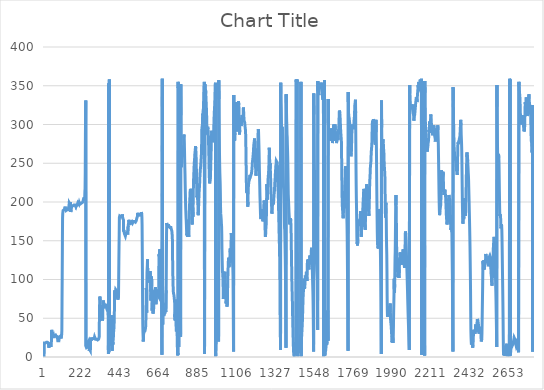
| Category | Series 0 |
|---|---|
| 0 | 0 |
| 1 | 18 |
| 2 | 18 |
| 3 | 18 |
| 4 | 18 |
| 5 | 18 |
| 6 | 18 |
| 7 | 18 |
| 8 | 18 |
| 9 | 19 |
| 10 | 19 |
| 11 | 19 |
| 12 | 19 |
| 13 | 19 |
| 14 | 19 |
| 15 | 19 |
| 16 | 19 |
| 17 | 19 |
| 18 | 19 |
| 19 | 19 |
| 20 | 19 |
| 21 | 19 |
| 22 | 19 |
| 23 | 19 |
| 24 | 18 |
| 25 | 18 |
| 26 | 14 |
| 27 | 12 |
| 28 | 13 |
| 29 | 15 |
| 30 | 15 |
| 31 | 15 |
| 32 | 15 |
| 33 | 15 |
| 34 | 15 |
| 35 | 15 |
| 36 | 15 |
| 37 | 15 |
| 38 | 15 |
| 39 | 15 |
| 40 | 15 |
| 41 | 15 |
| 42 | 16 |
| 43 | 35 |
| 44 | 30 |
| 45 | 28 |
| 46 | 27 |
| 47 | 26 |
| 48 | 26 |
| 49 | 26 |
| 50 | 26 |
| 51 | 26 |
| 52 | 28 |
| 53 | 26 |
| 54 | 26 |
| 55 | 25 |
| 56 | 26 |
| 57 | 26 |
| 58 | 26 |
| 59 | 26 |
| 60 | 26 |
| 61 | 27 |
| 62 | 30 |
| 63 | 29 |
| 64 | 28 |
| 65 | 28 |
| 66 | 28 |
| 67 | 27 |
| 68 | 27 |
| 69 | 27 |
| 70 | 27 |
| 71 | 27 |
| 72 | 27 |
| 73 | 27 |
| 74 | 27 |
| 75 | 26 |
| 76 | 26 |
| 77 | 23 |
| 78 | 21 |
| 79 | 21 |
| 80 | 21 |
| 81 | 21 |
| 82 | 21 |
| 83 | 21 |
| 84 | 21 |
| 85 | 21 |
| 86 | 21 |
| 87 | 26 |
| 88 | 26 |
| 89 | 26 |
| 90 | 26 |
| 91 | 26 |
| 92 | 26 |
| 93 | 27 |
| 94 | 27 |
| 95 | 27 |
| 96 | 24 |
| 97 | 23 |
| 98 | 23 |
| 99 | 23 |
| 100 | 29 |
| 101 | 34 |
| 102 | 72 |
| 103 | 104 |
| 104 | 141 |
| 105 | 179 |
| 106 | 185 |
| 107 | 187 |
| 108 | 189 |
| 109 | 190 |
| 110 | 190 |
| 111 | 189 |
| 112 | 189 |
| 113 | 190 |
| 114 | 190 |
| 115 | 190 |
| 116 | 190 |
| 117 | 190 |
| 118 | 192 |
| 119 | 193 |
| 120 | 194 |
| 121 | 192 |
| 122 | 191 |
| 123 | 191 |
| 124 | 191 |
| 125 | 189 |
| 126 | 189 |
| 127 | 189 |
| 128 | 189 |
| 129 | 189 |
| 130 | 189 |
| 131 | 190 |
| 132 | 190 |
| 133 | 190 |
| 134 | 190 |
| 135 | 190 |
| 136 | 190 |
| 137 | 190 |
| 138 | 190 |
| 139 | 190 |
| 140 | 190 |
| 141 | 190 |
| 142 | 196 |
| 143 | 199 |
| 144 | 198 |
| 145 | 198 |
| 146 | 198 |
| 147 | 198 |
| 148 | 197 |
| 149 | 197 |
| 150 | 200 |
| 151 | 195 |
| 152 | 187 |
| 153 | 190 |
| 154 | 190 |
| 155 | 190 |
| 156 | 190 |
| 157 | 194 |
| 158 | 195 |
| 159 | 194 |
| 160 | 194 |
| 161 | 194 |
| 162 | 194 |
| 163 | 195 |
| 164 | 194 |
| 165 | 194 |
| 166 | 196 |
| 167 | 196 |
| 168 | 196 |
| 169 | 196 |
| 170 | 195 |
| 171 | 195 |
| 172 | 195 |
| 173 | 195 |
| 174 | 195 |
| 175 | 196 |
| 176 | 196 |
| 177 | 195 |
| 178 | 195 |
| 179 | 195 |
| 180 | 194 |
| 181 | 195 |
| 182 | 195 |
| 183 | 197 |
| 184 | 195 |
| 185 | 196 |
| 186 | 196 |
| 187 | 196 |
| 188 | 196 |
| 189 | 197 |
| 190 | 197 |
| 191 | 197 |
| 192 | 199 |
| 193 | 199 |
| 194 | 198 |
| 195 | 198 |
| 196 | 198 |
| 197 | 198 |
| 198 | 197 |
| 199 | 198 |
| 200 | 199 |
| 201 | 198 |
| 202 | 198 |
| 203 | 197 |
| 204 | 198 |
| 205 | 198 |
| 206 | 198 |
| 207 | 198 |
| 208 | 198 |
| 209 | 198 |
| 210 | 198 |
| 211 | 199 |
| 212 | 199 |
| 213 | 199 |
| 214 | 199 |
| 215 | 199 |
| 216 | 199 |
| 217 | 200 |
| 218 | 200 |
| 219 | 200 |
| 220 | 200 |
| 221 | 200 |
| 222 | 202 |
| 223 | 202 |
| 224 | 202 |
| 225 | 203 |
| 226 | 203 |
| 227 | 203 |
| 228 | 206 |
| 229 | 204 |
| 230 | 202 |
| 231 | 206 |
| 232 | 214 |
| 233 | 217 |
| 234 | 239 |
| 235 | 287 |
| 236 | 310 |
| 237 | 331 |
| 238 | 14 |
| 239 | 15 |
| 240 | 14 |
| 241 | 12 |
| 242 | 12 |
| 243 | 13 |
| 244 | 13 |
| 245 | 11 |
| 246 | 11 |
| 247 | 13 |
| 248 | 15 |
| 249 | 18 |
| 250 | 18 |
| 251 | 19 |
| 252 | 19 |
| 253 | 20 |
| 254 | 20 |
| 255 | 17 |
| 256 | 15 |
| 257 | 8 |
| 258 | 10 |
| 259 | 9 |
| 260 | 10 |
| 261 | 10 |
| 262 | 10 |
| 263 | 8 |
| 264 | 9 |
| 265 | 25 |
| 266 | 21 |
| 267 | 23 |
| 268 | 23 |
| 269 | 22 |
| 270 | 23 |
| 271 | 23 |
| 272 | 23 |
| 273 | 23 |
| 274 | 23 |
| 275 | 23 |
| 276 | 23 |
| 277 | 23 |
| 278 | 24 |
| 279 | 24 |
| 280 | 24 |
| 281 | 24 |
| 282 | 24 |
| 283 | 24 |
| 284 | 24 |
| 285 | 24 |
| 286 | 24 |
| 287 | 26 |
| 288 | 25 |
| 289 | 25 |
| 290 | 25 |
| 291 | 25 |
| 292 | 23 |
| 293 | 23 |
| 294 | 23 |
| 295 | 23 |
| 296 | 23 |
| 297 | 23 |
| 298 | 23 |
| 299 | 22 |
| 300 | 22 |
| 301 | 22 |
| 302 | 22 |
| 303 | 22 |
| 304 | 22 |
| 305 | 22 |
| 306 | 22 |
| 307 | 22 |
| 308 | 22 |
| 309 | 22 |
| 310 | 23 |
| 311 | 23 |
| 312 | 24 |
| 313 | 26 |
| 314 | 40 |
| 315 | 58 |
| 316 | 72 |
| 317 | 78 |
| 318 | 77 |
| 319 | 73 |
| 320 | 67 |
| 321 | 64 |
| 322 | 61 |
| 323 | 59 |
| 324 | 57 |
| 325 | 56 |
| 326 | 56 |
| 327 | 56 |
| 328 | 53 |
| 329 | 51 |
| 330 | 49 |
| 331 | 48 |
| 332 | 47 |
| 333 | 49 |
| 334 | 65 |
| 335 | 68 |
| 336 | 73 |
| 337 | 72 |
| 338 | 70 |
| 339 | 70 |
| 340 | 69 |
| 341 | 70 |
| 342 | 70 |
| 343 | 69 |
| 344 | 68 |
| 345 | 65 |
| 346 | 65 |
| 347 | 65 |
| 348 | 66 |
| 349 | 66 |
| 350 | 66 |
| 351 | 66 |
| 352 | 65 |
| 353 | 65 |
| 354 | 64 |
| 355 | 65 |
| 356 | 66 |
| 357 | 66 |
| 358 | 66 |
| 359 | 66 |
| 360 | 66 |
| 361 | 67 |
| 362 | 67 |
| 363 | 63 |
| 364 | 55 |
| 365 | 13 |
| 366 | 4 |
| 367 | 353 |
| 368 | 6 |
| 369 | 6 |
| 370 | 6 |
| 371 | 358 |
| 372 | 15 |
| 373 | 25 |
| 374 | 28 |
| 375 | 29 |
| 376 | 32 |
| 377 | 35 |
| 378 | 39 |
| 379 | 41 |
| 380 | 42 |
| 381 | 40 |
| 382 | 54 |
| 383 | 49 |
| 384 | 37 |
| 385 | 34 |
| 386 | 14 |
| 387 | 8 |
| 388 | 18 |
| 389 | 20 |
| 390 | 18 |
| 391 | 16 |
| 392 | 19 |
| 393 | 24 |
| 394 | 26 |
| 395 | 32 |
| 396 | 34 |
| 397 | 37 |
| 398 | 42 |
| 399 | 51 |
| 400 | 65 |
| 401 | 84 |
| 402 | 86 |
| 403 | 82 |
| 404 | 76 |
| 405 | 83 |
| 406 | 84 |
| 407 | 87 |
| 408 | 88 |
| 409 | 86 |
| 410 | 88 |
| 411 | 88 |
| 412 | 88 |
| 413 | 85 |
| 414 | 84 |
| 415 | 85 |
| 416 | 83 |
| 417 | 80 |
| 418 | 77 |
| 419 | 74 |
| 420 | 75 |
| 421 | 73 |
| 422 | 75 |
| 423 | 78 |
| 424 | 101 |
| 425 | 123 |
| 426 | 142 |
| 427 | 158 |
| 428 | 180 |
| 429 | 181 |
| 430 | 182 |
| 431 | 182 |
| 432 | 181 |
| 433 | 181 |
| 434 | 181 |
| 435 | 181 |
| 436 | 181 |
| 437 | 181 |
| 438 | 181 |
| 439 | 181 |
| 440 | 181 |
| 441 | 181 |
| 442 | 182 |
| 443 | 181 |
| 444 | 182 |
| 445 | 184 |
| 446 | 182 |
| 447 | 179 |
| 448 | 180 |
| 449 | 180 |
| 450 | 180 |
| 451 | 177 |
| 452 | 162 |
| 453 | 164 |
| 454 | 162 |
| 455 | 162 |
| 456 | 161 |
| 457 | 159 |
| 458 | 159 |
| 459 | 159 |
| 460 | 159 |
| 461 | 158 |
| 462 | 156 |
| 463 | 157 |
| 464 | 158 |
| 465 | 159 |
| 466 | 159 |
| 467 | 159 |
| 468 | 160 |
| 469 | 160 |
| 470 | 161 |
| 471 | 161 |
| 472 | 161 |
| 473 | 161 |
| 474 | 160 |
| 475 | 158 |
| 476 | 159 |
| 477 | 159 |
| 478 | 169 |
| 479 | 171 |
| 480 | 172 |
| 481 | 173 |
| 482 | 177 |
| 483 | 174 |
| 484 | 172 |
| 485 | 171 |
| 486 | 172 |
| 487 | 172 |
| 488 | 171 |
| 489 | 172 |
| 490 | 172 |
| 491 | 173 |
| 492 | 172 |
| 493 | 174 |
| 494 | 175 |
| 495 | 175 |
| 496 | 175 |
| 497 | 175 |
| 498 | 175 |
| 499 | 175 |
| 500 | 175 |
| 501 | 174 |
| 502 | 174 |
| 503 | 173 |
| 504 | 174 |
| 505 | 174 |
| 506 | 174 |
| 507 | 175 |
| 508 | 175 |
| 509 | 175 |
| 510 | 175 |
| 511 | 175 |
| 512 | 175 |
| 513 | 175 |
| 514 | 175 |
| 515 | 175 |
| 516 | 174 |
| 517 | 174 |
| 518 | 174 |
| 519 | 174 |
| 520 | 175 |
| 521 | 175 |
| 522 | 175 |
| 523 | 175 |
| 524 | 176 |
| 525 | 177 |
| 526 | 177 |
| 527 | 179 |
| 528 | 180 |
| 529 | 178 |
| 530 | 180 |
| 531 | 182 |
| 532 | 186 |
| 533 | 183 |
| 534 | 183 |
| 535 | 183 |
| 536 | 183 |
| 537 | 183 |
| 538 | 183 |
| 539 | 184 |
| 540 | 184 |
| 541 | 183 |
| 542 | 184 |
| 543 | 185 |
| 544 | 184 |
| 545 | 183 |
| 546 | 184 |
| 547 | 184 |
| 548 | 183 |
| 549 | 184 |
| 550 | 184 |
| 551 | 184 |
| 552 | 184 |
| 553 | 187 |
| 554 | 188 |
| 555 | 185 |
| 556 | 181 |
| 557 | 171 |
| 558 | 143 |
| 559 | 110 |
| 560 | 69 |
| 561 | 42 |
| 562 | 32 |
| 563 | 31 |
| 564 | 20 |
| 565 | 26 |
| 566 | 30 |
| 567 | 31 |
| 568 | 32 |
| 569 | 32 |
| 570 | 32 |
| 571 | 32 |
| 572 | 32 |
| 573 | 33 |
| 574 | 34 |
| 575 | 33 |
| 576 | 34 |
| 577 | 35 |
| 578 | 40 |
| 579 | 52 |
| 580 | 66 |
| 581 | 89 |
| 582 | 85 |
| 583 | 57 |
| 584 | 87 |
| 585 | 109 |
| 586 | 110 |
| 587 | 119 |
| 588 | 126 |
| 589 | 106 |
| 590 | 99 |
| 591 | 99 |
| 592 | 104 |
| 593 | 99 |
| 594 | 96 |
| 595 | 97 |
| 596 | 95 |
| 597 | 98 |
| 598 | 103 |
| 599 | 102 |
| 600 | 99 |
| 601 | 99 |
| 602 | 111 |
| 603 | 112 |
| 604 | 103 |
| 605 | 94 |
| 606 | 78 |
| 607 | 73 |
| 608 | 80 |
| 609 | 86 |
| 610 | 94 |
| 611 | 104 |
| 612 | 91 |
| 613 | 77 |
| 614 | 60 |
| 615 | 63 |
| 616 | 75 |
| 617 | 73 |
| 618 | 58 |
| 619 | 56 |
| 620 | 57 |
| 621 | 58 |
| 622 | 59 |
| 623 | 63 |
| 624 | 68 |
| 625 | 78 |
| 626 | 82 |
| 627 | 86 |
| 628 | 85 |
| 629 | 86 |
| 630 | 83 |
| 631 | 87 |
| 632 | 87 |
| 633 | 90 |
| 634 | 85 |
| 635 | 79 |
| 636 | 68 |
| 637 | 68 |
| 638 | 69 |
| 639 | 81 |
| 640 | 87 |
| 641 | 86 |
| 642 | 85 |
| 643 | 85 |
| 644 | 83 |
| 645 | 82 |
| 646 | 80 |
| 647 | 80 |
| 648 | 80 |
| 649 | 81 |
| 650 | 80 |
| 651 | 78 |
| 652 | 104 |
| 653 | 131 |
| 654 | 133 |
| 655 | 130 |
| 656 | 130 |
| 657 | 139 |
| 658 | 140 |
| 659 | 139 |
| 660 | 140 |
| 661 | 138 |
| 662 | 136 |
| 663 | 139 |
| 664 | 139 |
| 665 | 129 |
| 666 | 106 |
| 667 | 87 |
| 668 | 58 |
| 669 | 25 |
| 670 | 3 |
| 671 | 4 |
| 672 | 359 |
| 673 | 359 |
| 674 | 42 |
| 675 | 54 |
| 676 | 70 |
| 677 | 67 |
| 678 | 64 |
| 679 | 60 |
| 680 | 53 |
| 681 | 54 |
| 682 | 55 |
| 683 | 55 |
| 684 | 54 |
| 685 | 55 |
| 686 | 56 |
| 687 | 56 |
| 688 | 57 |
| 689 | 59 |
| 690 | 61 |
| 691 | 62 |
| 692 | 58 |
| 693 | 59 |
| 694 | 86 |
| 695 | 120 |
| 696 | 157 |
| 697 | 173 |
| 698 | 171 |
| 699 | 172 |
| 700 | 172 |
| 701 | 170 |
| 702 | 169 |
| 703 | 167 |
| 704 | 169 |
| 705 | 168 |
| 706 | 167 |
| 707 | 171 |
| 708 | 171 |
| 709 | 169 |
| 710 | 169 |
| 711 | 168 |
| 712 | 168 |
| 713 | 168 |
| 714 | 168 |
| 715 | 167 |
| 716 | 167 |
| 717 | 167 |
| 718 | 167 |
| 719 | 167 |
| 720 | 167 |
| 721 | 167 |
| 722 | 166 |
| 723 | 165 |
| 724 | 164 |
| 725 | 164 |
| 726 | 163 |
| 727 | 163 |
| 728 | 162 |
| 729 | 155 |
| 730 | 142 |
| 731 | 116 |
| 732 | 105 |
| 733 | 97 |
| 734 | 85 |
| 735 | 85 |
| 736 | 82 |
| 737 | 82 |
| 738 | 80 |
| 739 | 78 |
| 740 | 79 |
| 741 | 77 |
| 742 | 71 |
| 743 | 52 |
| 744 | 55 |
| 745 | 47 |
| 746 | 51 |
| 747 | 74 |
| 748 | 72 |
| 749 | 59 |
| 750 | 45 |
| 751 | 35 |
| 752 | 33 |
| 753 | 32 |
| 754 | 38 |
| 755 | 41 |
| 756 | 43 |
| 757 | 27 |
| 758 | 5 |
| 759 | 2 |
| 760 | 5 |
| 761 | 3 |
| 762 | 355 |
| 763 | 347 |
| 764 | 351 |
| 765 | 13 |
| 766 | 32 |
| 767 | 51 |
| 768 | 71 |
| 769 | 80 |
| 770 | 92 |
| 771 | 99 |
| 772 | 100 |
| 773 | 95 |
| 774 | 83 |
| 775 | 57 |
| 776 | 26 |
| 777 | 352 |
| 778 | 312 |
| 779 | 273 |
| 780 | 248 |
| 781 | 245 |
| 782 | 252 |
| 783 | 256 |
| 784 | 256 |
| 785 | 256 |
| 786 | 261 |
| 787 | 262 |
| 788 | 261 |
| 789 | 263 |
| 790 | 262 |
| 791 | 259 |
| 792 | 262 |
| 793 | 271 |
| 794 | 282 |
| 795 | 287 |
| 796 | 283 |
| 797 | 277 |
| 798 | 269 |
| 799 | 256 |
| 800 | 245 |
| 801 | 236 |
| 802 | 223 |
| 803 | 212 |
| 804 | 201 |
| 805 | 192 |
| 806 | 186 |
| 807 | 180 |
| 808 | 176 |
| 809 | 170 |
| 810 | 163 |
| 811 | 157 |
| 812 | 158 |
| 813 | 159 |
| 814 | 157 |
| 815 | 155 |
| 816 | 160 |
| 817 | 169 |
| 818 | 177 |
| 819 | 177 |
| 820 | 168 |
| 821 | 161 |
| 822 | 155 |
| 823 | 163 |
| 824 | 173 |
| 825 | 182 |
| 826 | 190 |
| 827 | 196 |
| 828 | 202 |
| 829 | 207 |
| 830 | 213 |
| 831 | 215 |
| 832 | 217 |
| 833 | 216 |
| 834 | 213 |
| 835 | 211 |
| 836 | 206 |
| 837 | 200 |
| 838 | 196 |
| 839 | 194 |
| 840 | 185 |
| 841 | 173 |
| 842 | 171 |
| 843 | 182 |
| 844 | 189 |
| 845 | 184 |
| 846 | 181 |
| 847 | 193 |
| 848 | 213 |
| 849 | 221 |
| 850 | 230 |
| 851 | 236 |
| 852 | 241 |
| 853 | 247 |
| 854 | 251 |
| 855 | 255 |
| 856 | 257 |
| 857 | 262 |
| 858 | 264 |
| 859 | 265 |
| 860 | 269 |
| 861 | 272 |
| 862 | 269 |
| 863 | 265 |
| 864 | 260 |
| 865 | 251 |
| 866 | 239 |
| 867 | 225 |
| 868 | 210 |
| 869 | 206 |
| 870 | 208 |
| 871 | 208 |
| 872 | 206 |
| 873 | 206 |
| 874 | 198 |
| 875 | 188 |
| 876 | 183 |
| 877 | 184 |
| 878 | 191 |
| 879 | 199 |
| 880 | 206 |
| 881 | 212 |
| 882 | 216 |
| 883 | 217 |
| 884 | 223 |
| 885 | 230 |
| 886 | 234 |
| 887 | 238 |
| 888 | 242 |
| 889 | 243 |
| 890 | 246 |
| 891 | 246 |
| 892 | 247 |
| 893 | 245 |
| 894 | 246 |
| 895 | 264 |
| 896 | 284 |
| 897 | 295 |
| 898 | 296 |
| 899 | 295 |
| 900 | 300 |
| 901 | 308 |
| 902 | 314 |
| 903 | 312 |
| 904 | 307 |
| 905 | 318 |
| 906 | 323 |
| 907 | 331 |
| 908 | 340 |
| 909 | 346 |
| 910 | 351 |
| 911 | 355 |
| 912 | 4 |
| 913 | 4 |
| 914 | 352 |
| 915 | 341 |
| 916 | 341 |
| 917 | 343 |
| 918 | 345 |
| 919 | 340 |
| 920 | 335 |
| 921 | 330 |
| 922 | 324 |
| 923 | 319 |
| 924 | 311 |
| 925 | 302 |
| 926 | 293 |
| 927 | 287 |
| 928 | 289 |
| 929 | 295 |
| 930 | 297 |
| 931 | 296 |
| 932 | 294 |
| 933 | 291 |
| 934 | 285 |
| 935 | 276 |
| 936 | 267 |
| 937 | 257 |
| 938 | 244 |
| 939 | 235 |
| 940 | 228 |
| 941 | 224 |
| 942 | 224 |
| 943 | 223 |
| 944 | 224 |
| 945 | 225 |
| 946 | 234 |
| 947 | 244 |
| 948 | 253 |
| 949 | 262 |
| 950 | 269 |
| 951 | 279 |
| 952 | 286 |
| 953 | 292 |
| 954 | 291 |
| 955 | 284 |
| 956 | 281 |
| 957 | 286 |
| 958 | 291 |
| 959 | 289 |
| 960 | 277 |
| 961 | 280 |
| 962 | 285 |
| 963 | 286 |
| 964 | 293 |
| 965 | 299 |
| 966 | 306 |
| 967 | 313 |
| 968 | 318 |
| 969 | 321 |
| 970 | 327 |
| 971 | 332 |
| 972 | 340 |
| 973 | 347 |
| 974 | 354 |
| 975 | 1 |
| 976 | 5 |
| 977 | 11 |
| 978 | 17 |
| 979 | 22 |
| 980 | 27 |
| 981 | 31 |
| 982 | 37 |
| 983 | 42 |
| 984 | 47 |
| 985 | 51 |
| 986 | 54 |
| 987 | 58 |
| 988 | 60 |
| 989 | 56 |
| 990 | 54 |
| 991 | 40 |
| 992 | 20 |
| 993 | 357 |
| 994 | 333 |
| 995 | 305 |
| 996 | 282 |
| 997 | 263 |
| 998 | 249 |
| 999 | 238 |
| 1000 | 231 |
| 1001 | 224 |
| 1002 | 212 |
| 1003 | 194 |
| 1004 | 185 |
| 1005 | 183 |
| 1006 | 180 |
| 1007 | 177 |
| 1008 | 171 |
| 1009 | 169 |
| 1010 | 159 |
| 1011 | 139 |
| 1012 | 128 |
| 1013 | 118 |
| 1014 | 109 |
| 1015 | 109 |
| 1016 | 111 |
| 1017 | 103 |
| 1018 | 86 |
| 1019 | 75 |
| 1020 | 77 |
| 1021 | 81 |
| 1022 | 82 |
| 1023 | 85 |
| 1024 | 93 |
| 1025 | 99 |
| 1026 | 103 |
| 1027 | 107 |
| 1028 | 110 |
| 1029 | 106 |
| 1030 | 99 |
| 1031 | 91 |
| 1032 | 84 |
| 1033 | 77 |
| 1034 | 69 |
| 1035 | 68 |
| 1036 | 72 |
| 1037 | 77 |
| 1038 | 81 |
| 1039 | 69 |
| 1040 | 65 |
| 1041 | 65 |
| 1042 | 74 |
| 1043 | 85 |
| 1044 | 98 |
| 1045 | 107 |
| 1046 | 114 |
| 1047 | 121 |
| 1048 | 126 |
| 1049 | 128 |
| 1050 | 123 |
| 1051 | 116 |
| 1052 | 115 |
| 1053 | 120 |
| 1054 | 123 |
| 1055 | 124 |
| 1056 | 129 |
| 1057 | 134 |
| 1058 | 140 |
| 1059 | 135 |
| 1060 | 128 |
| 1061 | 129 |
| 1062 | 139 |
| 1063 | 149 |
| 1064 | 160 |
| 1065 | 160 |
| 1066 | 155 |
| 1067 | 144 |
| 1068 | 136 |
| 1069 | 137 |
| 1070 | 130 |
| 1071 | 123 |
| 1072 | 117 |
| 1073 | 115 |
| 1074 | 105 |
| 1075 | 74 |
| 1076 | 38 |
| 1077 | 7 |
| 1078 | 338 |
| 1079 | 310 |
| 1080 | 295 |
| 1081 | 290 |
| 1082 | 285 |
| 1083 | 279 |
| 1084 | 279 |
| 1085 | 289 |
| 1086 | 304 |
| 1087 | 316 |
| 1088 | 323 |
| 1089 | 329 |
| 1090 | 327 |
| 1091 | 325 |
| 1092 | 315 |
| 1093 | 305 |
| 1094 | 298 |
| 1095 | 291 |
| 1096 | 293 |
| 1097 | 299 |
| 1098 | 303 |
| 1099 | 308 |
| 1100 | 315 |
| 1101 | 323 |
| 1102 | 324 |
| 1103 | 317 |
| 1104 | 323 |
| 1105 | 330 |
| 1106 | 329 |
| 1107 | 325 |
| 1108 | 317 |
| 1109 | 305 |
| 1110 | 295 |
| 1111 | 287 |
| 1112 | 293 |
| 1113 | 299 |
| 1114 | 303 |
| 1115 | 308 |
| 1116 | 309 |
| 1117 | 306 |
| 1118 | 302 |
| 1119 | 301 |
| 1120 | 298 |
| 1121 | 298 |
| 1122 | 302 |
| 1123 | 304 |
| 1124 | 309 |
| 1125 | 312 |
| 1126 | 311 |
| 1127 | 309 |
| 1128 | 308 |
| 1129 | 304 |
| 1130 | 303 |
| 1131 | 310 |
| 1132 | 317 |
| 1133 | 322 |
| 1134 | 318 |
| 1135 | 313 |
| 1136 | 308 |
| 1137 | 305 |
| 1138 | 304 |
| 1139 | 304 |
| 1140 | 303 |
| 1141 | 301 |
| 1142 | 298 |
| 1143 | 297 |
| 1144 | 297 |
| 1145 | 292 |
| 1146 | 285 |
| 1147 | 272 |
| 1148 | 255 |
| 1149 | 238 |
| 1150 | 223 |
| 1151 | 215 |
| 1152 | 212 |
| 1153 | 216 |
| 1154 | 218 |
| 1155 | 214 |
| 1156 | 208 |
| 1157 | 200 |
| 1158 | 194 |
| 1159 | 200 |
| 1160 | 212 |
| 1161 | 219 |
| 1162 | 222 |
| 1163 | 224 |
| 1164 | 226 |
| 1165 | 228 |
| 1166 | 231 |
| 1167 | 230 |
| 1168 | 229 |
| 1169 | 233 |
| 1170 | 235 |
| 1171 | 236 |
| 1172 | 234 |
| 1173 | 233 |
| 1174 | 232 |
| 1175 | 233 |
| 1176 | 235 |
| 1177 | 235 |
| 1178 | 235 |
| 1179 | 237 |
| 1180 | 239 |
| 1181 | 240 |
| 1182 | 243 |
| 1183 | 247 |
| 1184 | 251 |
| 1185 | 253 |
| 1186 | 255 |
| 1187 | 257 |
| 1188 | 256 |
| 1189 | 258 |
| 1190 | 265 |
| 1191 | 270 |
| 1192 | 273 |
| 1193 | 276 |
| 1194 | 277 |
| 1195 | 278 |
| 1196 | 282 |
| 1197 | 277 |
| 1198 | 271 |
| 1199 | 263 |
| 1200 | 257 |
| 1201 | 250 |
| 1202 | 246 |
| 1203 | 240 |
| 1204 | 234 |
| 1205 | 233 |
| 1206 | 236 |
| 1207 | 241 |
| 1208 | 244 |
| 1209 | 247 |
| 1210 | 251 |
| 1211 | 258 |
| 1212 | 262 |
| 1213 | 265 |
| 1214 | 270 |
| 1215 | 277 |
| 1216 | 285 |
| 1217 | 291 |
| 1218 | 294 |
| 1219 | 291 |
| 1220 | 283 |
| 1221 | 274 |
| 1222 | 265 |
| 1223 | 253 |
| 1224 | 240 |
| 1225 | 230 |
| 1226 | 220 |
| 1227 | 208 |
| 1228 | 201 |
| 1229 | 193 |
| 1230 | 185 |
| 1231 | 180 |
| 1232 | 178 |
| 1233 | 177 |
| 1234 | 177 |
| 1235 | 177 |
| 1236 | 177 |
| 1237 | 179 |
| 1238 | 185 |
| 1239 | 191 |
| 1240 | 189 |
| 1241 | 185 |
| 1242 | 183 |
| 1243 | 177 |
| 1244 | 175 |
| 1245 | 176 |
| 1246 | 180 |
| 1247 | 185 |
| 1248 | 190 |
| 1249 | 196 |
| 1250 | 199 |
| 1251 | 202 |
| 1252 | 202 |
| 1253 | 198 |
| 1254 | 190 |
| 1255 | 178 |
| 1256 | 168 |
| 1257 | 158 |
| 1258 | 155 |
| 1259 | 157 |
| 1260 | 161 |
| 1261 | 167 |
| 1262 | 169 |
| 1263 | 176 |
| 1264 | 186 |
| 1265 | 205 |
| 1266 | 223 |
| 1267 | 224 |
| 1268 | 215 |
| 1269 | 203 |
| 1270 | 204 |
| 1271 | 212 |
| 1272 | 221 |
| 1273 | 229 |
| 1274 | 228 |
| 1275 | 235 |
| 1276 | 232 |
| 1277 | 240 |
| 1278 | 249 |
| 1279 | 258 |
| 1280 | 270 |
| 1281 | 266 |
| 1282 | 255 |
| 1283 | 251 |
| 1284 | 248 |
| 1285 | 250 |
| 1286 | 243 |
| 1287 | 235 |
| 1288 | 229 |
| 1289 | 220 |
| 1290 | 213 |
| 1291 | 207 |
| 1292 | 203 |
| 1293 | 197 |
| 1294 | 190 |
| 1295 | 185 |
| 1296 | 188 |
| 1297 | 192 |
| 1298 | 196 |
| 1299 | 198 |
| 1300 | 203 |
| 1301 | 203 |
| 1302 | 199 |
| 1303 | 197 |
| 1304 | 199 |
| 1305 | 202 |
| 1306 | 205 |
| 1307 | 209 |
| 1308 | 211 |
| 1309 | 212 |
| 1310 | 216 |
| 1311 | 223 |
| 1312 | 224 |
| 1313 | 229 |
| 1314 | 234 |
| 1315 | 235 |
| 1316 | 241 |
| 1317 | 246 |
| 1318 | 247 |
| 1319 | 249 |
| 1320 | 253 |
| 1321 | 253 |
| 1322 | 252 |
| 1323 | 254 |
| 1324 | 254 |
| 1325 | 251 |
| 1326 | 248 |
| 1327 | 243 |
| 1328 | 235 |
| 1329 | 226 |
| 1330 | 216 |
| 1331 | 210 |
| 1332 | 203 |
| 1333 | 191 |
| 1334 | 181 |
| 1335 | 170 |
| 1336 | 160 |
| 1337 | 151 |
| 1338 | 141 |
| 1339 | 128 |
| 1340 | 108 |
| 1341 | 80 |
| 1342 | 44 |
| 1343 | 28 |
| 1344 | 9 |
| 1345 | 354 |
| 1346 | 340 |
| 1347 | 328 |
| 1348 | 321 |
| 1349 | 306 |
| 1350 | 292 |
| 1351 | 286 |
| 1352 | 290 |
| 1353 | 297 |
| 1354 | 298 |
| 1355 | 291 |
| 1356 | 285 |
| 1357 | 269 |
| 1358 | 250 |
| 1359 | 237 |
| 1360 | 225 |
| 1361 | 219 |
| 1362 | 216 |
| 1363 | 208 |
| 1364 | 201 |
| 1365 | 191 |
| 1366 | 176 |
| 1367 | 166 |
| 1368 | 164 |
| 1369 | 151 |
| 1370 | 139 |
| 1371 | 126 |
| 1372 | 109 |
| 1373 | 82 |
| 1374 | 46 |
| 1375 | 12 |
| 1376 | 339 |
| 1377 | 328 |
| 1378 | 315 |
| 1379 | 303 |
| 1380 | 298 |
| 1381 | 287 |
| 1382 | 284 |
| 1383 | 274 |
| 1384 | 266 |
| 1385 | 257 |
| 1386 | 244 |
| 1387 | 226 |
| 1388 | 210 |
| 1389 | 204 |
| 1390 | 199 |
| 1391 | 193 |
| 1392 | 187 |
| 1393 | 183 |
| 1394 | 179 |
| 1395 | 174 |
| 1396 | 171 |
| 1397 | 170 |
| 1398 | 171 |
| 1399 | 172 |
| 1400 | 175 |
| 1401 | 179 |
| 1402 | 176 |
| 1403 | 172 |
| 1404 | 164 |
| 1405 | 148 |
| 1406 | 133 |
| 1407 | 118 |
| 1408 | 105 |
| 1409 | 91 |
| 1410 | 84 |
| 1411 | 76 |
| 1412 | 65 |
| 1413 | 50 |
| 1414 | 40 |
| 1415 | 31 |
| 1416 | 22 |
| 1417 | 14 |
| 1418 | 8 |
| 1419 | 3 |
| 1420 | 2 |
| 1421 | 2 |
| 1422 | 1 |
| 1423 | 1 |
| 1424 | 3 |
| 1425 | 6 |
| 1426 | 8 |
| 1427 | 11 |
| 1428 | 14 |
| 1429 | 17 |
| 1430 | 19 |
| 1431 | 15 |
| 1432 | 7 |
| 1433 | 358 |
| 1434 | 355 |
| 1435 | 353 |
| 1436 | 352 |
| 1437 | 352 |
| 1438 | 355 |
| 1439 | 358 |
| 1440 | 1 |
| 1441 | 3 |
| 1442 | 6 |
| 1443 | 7 |
| 1444 | 10 |
| 1445 | 13 |
| 1446 | 14 |
| 1447 | 14 |
| 1448 | 14 |
| 1449 | 15 |
| 1450 | 14 |
| 1451 | 10 |
| 1452 | 10 |
| 1453 | 16 |
| 1454 | 20 |
| 1455 | 20 |
| 1456 | 24 |
| 1457 | 29 |
| 1458 | 23 |
| 1459 | 5 |
| 1460 | 355 |
| 1461 | 1 |
| 1462 | 12 |
| 1463 | 22 |
| 1464 | 27 |
| 1465 | 30 |
| 1466 | 36 |
| 1467 | 39 |
| 1468 | 44 |
| 1469 | 51 |
| 1470 | 59 |
| 1471 | 67 |
| 1472 | 76 |
| 1473 | 80 |
| 1474 | 81 |
| 1475 | 89 |
| 1476 | 95 |
| 1477 | 99 |
| 1478 | 101 |
| 1479 | 95 |
| 1480 | 88 |
| 1481 | 87 |
| 1482 | 90 |
| 1483 | 96 |
| 1484 | 102 |
| 1485 | 105 |
| 1486 | 105 |
| 1487 | 101 |
| 1488 | 101 |
| 1489 | 104 |
| 1490 | 108 |
| 1491 | 110 |
| 1492 | 108 |
| 1493 | 100 |
| 1494 | 98 |
| 1495 | 103 |
| 1496 | 115 |
| 1497 | 125 |
| 1498 | 126 |
| 1499 | 124 |
| 1500 | 123 |
| 1501 | 126 |
| 1502 | 125 |
| 1503 | 120 |
| 1504 | 115 |
| 1505 | 113 |
| 1506 | 115 |
| 1507 | 117 |
| 1508 | 117 |
| 1509 | 121 |
| 1510 | 128 |
| 1511 | 131 |
| 1512 | 127 |
| 1513 | 123 |
| 1514 | 120 |
| 1515 | 120 |
| 1516 | 121 |
| 1517 | 123 |
| 1518 | 131 |
| 1519 | 137 |
| 1520 | 141 |
| 1521 | 136 |
| 1522 | 128 |
| 1523 | 121 |
| 1524 | 115 |
| 1525 | 111 |
| 1526 | 101 |
| 1527 | 92 |
| 1528 | 84 |
| 1529 | 72 |
| 1530 | 55 |
| 1531 | 33 |
| 1532 | 7 |
| 1533 | 340 |
| 1534 | 313 |
| 1535 | 282 |
| 1536 | 251 |
| 1537 | 231 |
| 1538 | 241 |
| 1539 | 229 |
| 1540 | 215 |
| 1541 | 201 |
| 1542 | 189 |
| 1543 | 178 |
| 1544 | 161 |
| 1545 | 146 |
| 1546 | 134 |
| 1547 | 127 |
| 1548 | 124 |
| 1549 | 118 |
| 1550 | 111 |
| 1551 | 110 |
| 1552 | 110 |
| 1553 | 98 |
| 1554 | 67 |
| 1555 | 35 |
| 1556 | 356 |
| 1557 | 343 |
| 1558 | 352 |
| 1559 | 344 |
| 1560 | 340 |
| 1561 | 340 |
| 1562 | 338 |
| 1563 | 340 |
| 1564 | 346 |
| 1565 | 353 |
| 1566 | 353 |
| 1567 | 353 |
| 1568 | 352 |
| 1569 | 351 |
| 1570 | 351 |
| 1571 | 354 |
| 1572 | 354 |
| 1573 | 354 |
| 1574 | 350 |
| 1575 | 347 |
| 1576 | 346 |
| 1577 | 352 |
| 1578 | 353 |
| 1579 | 349 |
| 1580 | 348 |
| 1581 | 346 |
| 1582 | 340 |
| 1583 | 335 |
| 1584 | 335 |
| 1585 | 332 |
| 1586 | 333 |
| 1587 | 343 |
| 1588 | 354 |
| 1589 | 1 |
| 1590 | 2 |
| 1591 | 353 |
| 1592 | 350 |
| 1593 | 353 |
| 1594 | 357 |
| 1595 | 2 |
| 1596 | 2 |
| 1597 | 3 |
| 1598 | 5 |
| 1599 | 7 |
| 1600 | 8 |
| 1601 | 9 |
| 1602 | 12 |
| 1603 | 14 |
| 1604 | 18 |
| 1605 | 22 |
| 1606 | 19 |
| 1607 | 16 |
| 1608 | 20 |
| 1609 | 30 |
| 1610 | 41 |
| 1611 | 52 |
| 1612 | 60 |
| 1613 | 61 |
| 1614 | 21 |
| 1615 | 333 |
| 1616 | 301 |
| 1617 | 283 |
| 1618 | 280 |
| 1619 | 279 |
| 1620 | 281 |
| 1621 | 285 |
| 1622 | 289 |
| 1623 | 287 |
| 1624 | 284 |
| 1625 | 282 |
| 1626 | 279 |
| 1627 | 284 |
| 1628 | 288 |
| 1629 | 292 |
| 1630 | 295 |
| 1631 | 295 |
| 1632 | 290 |
| 1633 | 287 |
| 1634 | 286 |
| 1635 | 286 |
| 1636 | 289 |
| 1637 | 291 |
| 1638 | 286 |
| 1639 | 276 |
| 1640 | 276 |
| 1641 | 282 |
| 1642 | 285 |
| 1643 | 279 |
| 1644 | 286 |
| 1645 | 292 |
| 1646 | 300 |
| 1647 | 298 |
| 1648 | 291 |
| 1649 | 279 |
| 1650 | 282 |
| 1651 | 289 |
| 1652 | 289 |
| 1653 | 294 |
| 1654 | 300 |
| 1655 | 293 |
| 1656 | 284 |
| 1657 | 283 |
| 1658 | 286 |
| 1659 | 289 |
| 1660 | 288 |
| 1661 | 282 |
| 1662 | 276 |
| 1663 | 276 |
| 1664 | 277 |
| 1665 | 280 |
| 1666 | 283 |
| 1667 | 287 |
| 1668 | 291 |
| 1669 | 289 |
| 1670 | 280 |
| 1671 | 279 |
| 1672 | 283 |
| 1673 | 288 |
| 1674 | 293 |
| 1675 | 296 |
| 1676 | 300 |
| 1677 | 308 |
| 1678 | 316 |
| 1679 | 318 |
| 1680 | 318 |
| 1681 | 315 |
| 1682 | 312 |
| 1683 | 308 |
| 1684 | 302 |
| 1685 | 296 |
| 1686 | 292 |
| 1687 | 288 |
| 1688 | 285 |
| 1689 | 282 |
| 1690 | 278 |
| 1691 | 263 |
| 1692 | 242 |
| 1693 | 223 |
| 1694 | 207 |
| 1695 | 198 |
| 1696 | 191 |
| 1697 | 189 |
| 1698 | 188 |
| 1699 | 183 |
| 1700 | 179 |
| 1701 | 183 |
| 1702 | 192 |
| 1703 | 202 |
| 1704 | 208 |
| 1705 | 203 |
| 1706 | 192 |
| 1707 | 198 |
| 1708 | 211 |
| 1709 | 219 |
| 1710 | 223 |
| 1711 | 230 |
| 1712 | 237 |
| 1713 | 246 |
| 1714 | 245 |
| 1715 | 235 |
| 1716 | 224 |
| 1717 | 216 |
| 1718 | 208 |
| 1719 | 199 |
| 1720 | 191 |
| 1721 | 180 |
| 1722 | 171 |
| 1723 | 155 |
| 1724 | 130 |
| 1725 | 100 |
| 1726 | 74 |
| 1727 | 44 |
| 1728 | 8 |
| 1729 | 342 |
| 1730 | 323 |
| 1731 | 314 |
| 1732 | 311 |
| 1733 | 312 |
| 1734 | 310 |
| 1735 | 307 |
| 1736 | 303 |
| 1737 | 302 |
| 1738 | 301 |
| 1739 | 295 |
| 1740 | 288 |
| 1741 | 283 |
| 1742 | 276 |
| 1743 | 266 |
| 1744 | 259 |
| 1745 | 259 |
| 1746 | 263 |
| 1747 | 266 |
| 1748 | 274 |
| 1749 | 284 |
| 1750 | 292 |
| 1751 | 298 |
| 1752 | 300 |
| 1753 | 298 |
| 1754 | 297 |
| 1755 | 298 |
| 1756 | 296 |
| 1757 | 294 |
| 1758 | 295 |
| 1759 | 296 |
| 1760 | 298 |
| 1761 | 301 |
| 1762 | 305 |
| 1763 | 308 |
| 1764 | 310 |
| 1765 | 316 |
| 1766 | 324 |
| 1767 | 326 |
| 1768 | 326 |
| 1769 | 327 |
| 1770 | 332 |
| 1771 | 315 |
| 1772 | 278 |
| 1773 | 246 |
| 1774 | 223 |
| 1775 | 205 |
| 1776 | 193 |
| 1777 | 175 |
| 1778 | 154 |
| 1779 | 146 |
| 1780 | 147 |
| 1781 | 148 |
| 1782 | 144 |
| 1783 | 153 |
| 1784 | 167 |
| 1785 | 171 |
| 1786 | 171 |
| 1787 | 171 |
| 1788 | 177 |
| 1789 | 177 |
| 1790 | 175 |
| 1791 | 175 |
| 1792 | 174 |
| 1793 | 177 |
| 1794 | 173 |
| 1795 | 169 |
| 1796 | 177 |
| 1797 | 181 |
| 1798 | 185 |
| 1799 | 188 |
| 1800 | 175 |
| 1801 | 166 |
| 1802 | 158 |
| 1803 | 155 |
| 1804 | 160 |
| 1805 | 167 |
| 1806 | 173 |
| 1807 | 179 |
| 1808 | 176 |
| 1809 | 168 |
| 1810 | 174 |
| 1811 | 187 |
| 1812 | 192 |
| 1813 | 197 |
| 1814 | 202 |
| 1815 | 206 |
| 1816 | 212 |
| 1817 | 215 |
| 1818 | 217 |
| 1819 | 217 |
| 1820 | 215 |
| 1821 | 210 |
| 1822 | 197 |
| 1823 | 185 |
| 1824 | 172 |
| 1825 | 164 |
| 1826 | 171 |
| 1827 | 182 |
| 1828 | 193 |
| 1829 | 200 |
| 1830 | 203 |
| 1831 | 207 |
| 1832 | 212 |
| 1833 | 217 |
| 1834 | 223 |
| 1835 | 223 |
| 1836 | 213 |
| 1837 | 206 |
| 1838 | 199 |
| 1839 | 192 |
| 1840 | 188 |
| 1841 | 191 |
| 1842 | 195 |
| 1843 | 199 |
| 1844 | 195 |
| 1845 | 187 |
| 1846 | 182 |
| 1847 | 185 |
| 1848 | 194 |
| 1849 | 203 |
| 1850 | 216 |
| 1851 | 225 |
| 1852 | 230 |
| 1853 | 234 |
| 1854 | 240 |
| 1855 | 246 |
| 1856 | 248 |
| 1857 | 249 |
| 1858 | 253 |
| 1859 | 260 |
| 1860 | 265 |
| 1861 | 268 |
| 1862 | 271 |
| 1863 | 274 |
| 1864 | 283 |
| 1865 | 294 |
| 1866 | 302 |
| 1867 | 305 |
| 1868 | 304 |
| 1869 | 304 |
| 1870 | 303 |
| 1871 | 305 |
| 1872 | 307 |
| 1873 | 308 |
| 1874 | 304 |
| 1875 | 296 |
| 1876 | 288 |
| 1877 | 282 |
| 1878 | 281 |
| 1879 | 283 |
| 1880 | 278 |
| 1881 | 276 |
| 1882 | 274 |
| 1883 | 284 |
| 1884 | 293 |
| 1885 | 298 |
| 1886 | 301 |
| 1887 | 306 |
| 1888 | 290 |
| 1889 | 272 |
| 1890 | 248 |
| 1891 | 222 |
| 1892 | 199 |
| 1893 | 180 |
| 1894 | 161 |
| 1895 | 150 |
| 1896 | 145 |
| 1897 | 147 |
| 1898 | 146 |
| 1899 | 140 |
| 1900 | 142 |
| 1901 | 147 |
| 1902 | 156 |
| 1903 | 169 |
| 1904 | 182 |
| 1905 | 191 |
| 1906 | 192 |
| 1907 | 192 |
| 1908 | 188 |
| 1909 | 182 |
| 1910 | 171 |
| 1911 | 147 |
| 1912 | 132 |
| 1913 | 115 |
| 1914 | 96 |
| 1915 | 72 |
| 1916 | 40 |
| 1917 | 4 |
| 1918 | 331 |
| 1919 | 296 |
| 1920 | 275 |
| 1921 | 266 |
| 1922 | 261 |
| 1923 | 258 |
| 1924 | 261 |
| 1925 | 272 |
| 1926 | 281 |
| 1927 | 276 |
| 1928 | 272 |
| 1929 | 274 |
| 1930 | 268 |
| 1931 | 266 |
| 1932 | 261 |
| 1933 | 251 |
| 1934 | 246 |
| 1935 | 243 |
| 1936 | 239 |
| 1937 | 235 |
| 1938 | 222 |
| 1939 | 202 |
| 1940 | 185 |
| 1941 | 180 |
| 1942 | 192 |
| 1943 | 199 |
| 1944 | 196 |
| 1945 | 181 |
| 1946 | 156 |
| 1947 | 142 |
| 1948 | 132 |
| 1949 | 111 |
| 1950 | 79 |
| 1951 | 60 |
| 1952 | 52 |
| 1953 | 62 |
| 1954 | 65 |
| 1955 | 57 |
| 1956 | 55 |
| 1957 | 57 |
| 1958 | 59 |
| 1959 | 61 |
| 1960 | 63 |
| 1961 | 64 |
| 1962 | 65 |
| 1963 | 66 |
| 1964 | 61 |
| 1965 | 53 |
| 1966 | 62 |
| 1967 | 69 |
| 1968 | 61 |
| 1969 | 50 |
| 1970 | 47 |
| 1971 | 46 |
| 1972 | 46 |
| 1973 | 40 |
| 1974 | 39 |
| 1975 | 32 |
| 1976 | 28 |
| 1977 | 26 |
| 1978 | 19 |
| 1979 | 19 |
| 1980 | 28 |
| 1981 | 45 |
| 1982 | 38 |
| 1983 | 18 |
| 1984 | 24 |
| 1985 | 32 |
| 1986 | 43 |
| 1987 | 57 |
| 1988 | 68 |
| 1989 | 81 |
| 1990 | 101 |
| 1991 | 88 |
| 1992 | 83 |
| 1993 | 94 |
| 1994 | 111 |
| 1995 | 128 |
| 1996 | 136 |
| 1997 | 155 |
| 1998 | 178 |
| 1999 | 196 |
| 2000 | 209 |
| 2001 | 196 |
| 2002 | 184 |
| 2003 | 163 |
| 2004 | 141 |
| 2005 | 131 |
| 2006 | 125 |
| 2007 | 123 |
| 2008 | 120 |
| 2009 | 114 |
| 2010 | 107 |
| 2011 | 103 |
| 2012 | 103 |
| 2013 | 108 |
| 2014 | 116 |
| 2015 | 120 |
| 2016 | 111 |
| 2017 | 102 |
| 2018 | 103 |
| 2019 | 113 |
| 2020 | 121 |
| 2021 | 127 |
| 2022 | 125 |
| 2023 | 129 |
| 2024 | 135 |
| 2025 | 131 |
| 2026 | 128 |
| 2027 | 128 |
| 2028 | 130 |
| 2029 | 134 |
| 2030 | 134 |
| 2031 | 132 |
| 2032 | 130 |
| 2033 | 125 |
| 2034 | 119 |
| 2035 | 119 |
| 2036 | 123 |
| 2037 | 127 |
| 2038 | 131 |
| 2039 | 136 |
| 2040 | 139 |
| 2041 | 139 |
| 2042 | 140 |
| 2043 | 137 |
| 2044 | 133 |
| 2045 | 129 |
| 2046 | 126 |
| 2047 | 123 |
| 2048 | 117 |
| 2049 | 115 |
| 2050 | 123 |
| 2051 | 132 |
| 2052 | 141 |
| 2053 | 156 |
| 2054 | 162 |
| 2055 | 161 |
| 2056 | 158 |
| 2057 | 154 |
| 2058 | 148 |
| 2059 | 140 |
| 2060 | 131 |
| 2061 | 123 |
| 2062 | 116 |
| 2063 | 108 |
| 2064 | 100 |
| 2065 | 92 |
| 2066 | 84 |
| 2067 | 74 |
| 2068 | 66 |
| 2069 | 57 |
| 2070 | 50 |
| 2071 | 43 |
| 2072 | 36 |
| 2073 | 28 |
| 2074 | 20 |
| 2075 | 14 |
| 2076 | 9 |
| 2077 | 9 |
| 2078 | 351 |
| 2079 | 340 |
| 2080 | 332 |
| 2081 | 329 |
| 2082 | 326 |
| 2083 | 321 |
| 2084 | 321 |
| 2085 | 321 |
| 2086 | 321 |
| 2087 | 322 |
| 2088 | 322 |
| 2089 | 321 |
| 2090 | 323 |
| 2091 | 324 |
| 2092 | 326 |
| 2093 | 327 |
| 2094 | 326 |
| 2095 | 322 |
| 2096 | 318 |
| 2097 | 315 |
| 2098 | 316 |
| 2099 | 314 |
| 2100 | 313 |
| 2101 | 310 |
| 2102 | 305 |
| 2103 | 307 |
| 2104 | 309 |
| 2105 | 311 |
| 2106 | 312 |
| 2107 | 313 |
| 2108 | 316 |
| 2109 | 319 |
| 2110 | 321 |
| 2111 | 324 |
| 2112 | 327 |
| 2113 | 329 |
| 2114 | 332 |
| 2115 | 333 |
| 2116 | 335 |
| 2117 | 336 |
| 2118 | 334 |
| 2119 | 331 |
| 2120 | 329 |
| 2121 | 331 |
| 2122 | 337 |
| 2123 | 340 |
| 2124 | 340 |
| 2125 | 346 |
| 2126 | 351 |
| 2127 | 349 |
| 2128 | 347 |
| 2129 | 351 |
| 2130 | 355 |
| 2131 | 350 |
| 2132 | 348 |
| 2133 | 349 |
| 2134 | 348 |
| 2135 | 347 |
| 2136 | 346 |
| 2137 | 348 |
| 2138 | 358 |
| 2139 | 358 |
| 2140 | 352 |
| 2141 | 355 |
| 2142 | 355 |
| 2143 | 352 |
| 2144 | 355 |
| 2145 | 359 |
| 2146 | 3 |
| 2147 | 3 |
| 2148 | 2 |
| 2149 | 4 |
| 2150 | 9 |
| 2151 | 13 |
| 2152 | 19 |
| 2153 | 26 |
| 2154 | 21 |
| 2155 | 14 |
| 2156 | 5 |
| 2157 | 356 |
| 2158 | 346 |
| 2159 | 336 |
| 2160 | 336 |
| 2161 | 345 |
| 2162 | 353 |
| 2163 | 2 |
| 2164 | 356 |
| 2165 | 341 |
| 2166 | 321 |
| 2167 | 308 |
| 2168 | 296 |
| 2169 | 286 |
| 2170 | 281 |
| 2171 | 279 |
| 2172 | 278 |
| 2173 | 271 |
| 2174 | 270 |
| 2175 | 274 |
| 2176 | 275 |
| 2177 | 269 |
| 2178 | 265 |
| 2179 | 266 |
| 2180 | 269 |
| 2181 | 270 |
| 2182 | 273 |
| 2183 | 276 |
| 2184 | 277 |
| 2185 | 279 |
| 2186 | 283 |
| 2187 | 287 |
| 2188 | 293 |
| 2189 | 290 |
| 2190 | 290 |
| 2191 | 302 |
| 2192 | 304 |
| 2193 | 300 |
| 2194 | 292 |
| 2195 | 289 |
| 2196 | 300 |
| 2197 | 306 |
| 2198 | 313 |
| 2199 | 311 |
| 2200 | 308 |
| 2201 | 304 |
| 2202 | 300 |
| 2203 | 294 |
| 2204 | 293 |
| 2205 | 294 |
| 2206 | 291 |
| 2207 | 291 |
| 2208 | 289 |
| 2209 | 286 |
| 2210 | 288 |
| 2211 | 289 |
| 2212 | 292 |
| 2213 | 293 |
| 2214 | 297 |
| 2215 | 299 |
| 2216 | 299 |
| 2217 | 295 |
| 2218 | 291 |
| 2219 | 289 |
| 2220 | 287 |
| 2221 | 284 |
| 2222 | 283 |
| 2223 | 282 |
| 2224 | 278 |
| 2225 | 279 |
| 2226 | 283 |
| 2227 | 285 |
| 2228 | 292 |
| 2229 | 295 |
| 2230 | 292 |
| 2231 | 290 |
| 2232 | 287 |
| 2233 | 286 |
| 2234 | 285 |
| 2235 | 287 |
| 2236 | 291 |
| 2237 | 296 |
| 2238 | 299 |
| 2239 | 293 |
| 2240 | 284 |
| 2241 | 274 |
| 2242 | 259 |
| 2243 | 243 |
| 2244 | 226 |
| 2245 | 210 |
| 2246 | 198 |
| 2247 | 189 |
| 2248 | 183 |
| 2249 | 183 |
| 2250 | 188 |
| 2251 | 190 |
| 2252 | 191 |
| 2253 | 190 |
| 2254 | 190 |
| 2255 | 197 |
| 2256 | 209 |
| 2257 | 222 |
| 2258 | 233 |
| 2259 | 241 |
| 2260 | 239 |
| 2261 | 229 |
| 2262 | 223 |
| 2263 | 218 |
| 2264 | 215 |
| 2265 | 218 |
| 2266 | 225 |
| 2267 | 233 |
| 2268 | 239 |
| 2269 | 234 |
| 2270 | 223 |
| 2271 | 213 |
| 2272 | 209 |
| 2273 | 209 |
| 2274 | 210 |
| 2275 | 211 |
| 2276 | 214 |
| 2277 | 215 |
| 2278 | 216 |
| 2279 | 217 |
| 2280 | 213 |
| 2281 | 212 |
| 2282 | 208 |
| 2283 | 204 |
| 2284 | 198 |
| 2285 | 192 |
| 2286 | 188 |
| 2287 | 181 |
| 2288 | 178 |
| 2289 | 174 |
| 2290 | 171 |
| 2291 | 171 |
| 2292 | 171 |
| 2293 | 175 |
| 2294 | 180 |
| 2295 | 187 |
| 2296 | 192 |
| 2297 | 196 |
| 2298 | 199 |
| 2299 | 203 |
| 2300 | 206 |
| 2301 | 209 |
| 2302 | 208 |
| 2303 | 206 |
| 2304 | 206 |
| 2305 | 205 |
| 2306 | 203 |
| 2307 | 201 |
| 2308 | 196 |
| 2309 | 188 |
| 2310 | 179 |
| 2311 | 170 |
| 2312 | 164 |
| 2313 | 164 |
| 2314 | 166 |
| 2315 | 168 |
| 2316 | 172 |
| 2317 | 173 |
| 2318 | 161 |
| 2319 | 143 |
| 2320 | 122 |
| 2321 | 102 |
| 2322 | 64 |
| 2323 | 29 |
| 2324 | 7 |
| 2325 | 348 |
| 2326 | 331 |
| 2327 | 315 |
| 2328 | 300 |
| 2329 | 287 |
| 2330 | 277 |
| 2331 | 269 |
| 2332 | 266 |
| 2333 | 262 |
| 2334 | 260 |
| 2335 | 258 |
| 2336 | 257 |
| 2337 | 255 |
| 2338 | 254 |
| 2339 | 254 |
| 2340 | 254 |
| 2341 | 253 |
| 2342 | 251 |
| 2343 | 248 |
| 2344 | 244 |
| 2345 | 240 |
| 2346 | 239 |
| 2347 | 238 |
| 2348 | 235 |
| 2349 | 237 |
| 2350 | 247 |
| 2351 | 264 |
| 2352 | 273 |
| 2353 | 277 |
| 2354 | 277 |
| 2355 | 275 |
| 2356 | 275 |
| 2357 | 276 |
| 2358 | 276 |
| 2359 | 279 |
| 2360 | 281 |
| 2361 | 281 |
| 2362 | 282 |
| 2363 | 282 |
| 2364 | 285 |
| 2365 | 290 |
| 2366 | 295 |
| 2367 | 300 |
| 2368 | 306 |
| 2369 | 306 |
| 2370 | 299 |
| 2371 | 287 |
| 2372 | 282 |
| 2373 | 276 |
| 2374 | 267 |
| 2375 | 252 |
| 2376 | 233 |
| 2377 | 214 |
| 2378 | 195 |
| 2379 | 183 |
| 2380 | 174 |
| 2381 | 172 |
| 2382 | 175 |
| 2383 | 182 |
| 2384 | 180 |
| 2385 | 178 |
| 2386 | 178 |
| 2387 | 181 |
| 2388 | 188 |
| 2389 | 198 |
| 2390 | 202 |
| 2391 | 205 |
| 2392 | 202 |
| 2393 | 193 |
| 2394 | 184 |
| 2395 | 182 |
| 2396 | 185 |
| 2397 | 192 |
| 2398 | 206 |
| 2399 | 219 |
| 2400 | 231 |
| 2401 | 241 |
| 2402 | 251 |
| 2403 | 260 |
| 2404 | 264 |
| 2405 | 258 |
| 2406 | 260 |
| 2407 | 259 |
| 2408 | 253 |
| 2409 | 248 |
| 2410 | 244 |
| 2411 | 238 |
| 2412 | 234 |
| 2413 | 228 |
| 2414 | 218 |
| 2415 | 209 |
| 2416 | 200 |
| 2417 | 189 |
| 2418 | 179 |
| 2419 | 168 |
| 2420 | 156 |
| 2421 | 143 |
| 2422 | 126 |
| 2423 | 108 |
| 2424 | 88 |
| 2425 | 60 |
| 2426 | 35 |
| 2427 | 26 |
| 2428 | 20 |
| 2429 | 16 |
| 2430 | 16 |
| 2431 | 21 |
| 2432 | 25 |
| 2433 | 25 |
| 2434 | 21 |
| 2435 | 16 |
| 2436 | 12 |
| 2437 | 12 |
| 2438 | 15 |
| 2439 | 20 |
| 2440 | 26 |
| 2441 | 30 |
| 2442 | 35 |
| 2443 | 33 |
| 2444 | 34 |
| 2445 | 35 |
| 2446 | 34 |
| 2447 | 32 |
| 2448 | 31 |
| 2449 | 30 |
| 2450 | 32 |
| 2451 | 34 |
| 2452 | 37 |
| 2453 | 40 |
| 2454 | 42 |
| 2455 | 38 |
| 2456 | 32 |
| 2457 | 31 |
| 2458 | 33 |
| 2459 | 37 |
| 2460 | 41 |
| 2461 | 44 |
| 2462 | 46 |
| 2463 | 49 |
| 2464 | 48 |
| 2465 | 48 |
| 2466 | 47 |
| 2467 | 46 |
| 2468 | 46 |
| 2469 | 42 |
| 2470 | 37 |
| 2471 | 34 |
| 2472 | 32 |
| 2473 | 30 |
| 2474 | 31 |
| 2475 | 32 |
| 2476 | 33 |
| 2477 | 33 |
| 2478 | 34 |
| 2479 | 35 |
| 2480 | 37 |
| 2481 | 39 |
| 2482 | 36 |
| 2483 | 31 |
| 2484 | 25 |
| 2485 | 20 |
| 2486 | 19 |
| 2487 | 21 |
| 2488 | 23 |
| 2489 | 31 |
| 2490 | 45 |
| 2491 | 61 |
| 2492 | 76 |
| 2493 | 92 |
| 2494 | 112 |
| 2495 | 124 |
| 2496 | 119 |
| 2497 | 113 |
| 2498 | 116 |
| 2499 | 122 |
| 2500 | 125 |
| 2501 | 119 |
| 2502 | 113 |
| 2503 | 114 |
| 2504 | 116 |
| 2505 | 116 |
| 2506 | 119 |
| 2507 | 118 |
| 2508 | 119 |
| 2509 | 122 |
| 2510 | 128 |
| 2511 | 133 |
| 2512 | 133 |
| 2513 | 132 |
| 2514 | 128 |
| 2515 | 127 |
| 2516 | 128 |
| 2517 | 127 |
| 2518 | 126 |
| 2519 | 128 |
| 2520 | 129 |
| 2521 | 127 |
| 2522 | 122 |
| 2523 | 121 |
| 2524 | 121 |
| 2525 | 120 |
| 2526 | 117 |
| 2527 | 116 |
| 2528 | 119 |
| 2529 | 125 |
| 2530 | 129 |
| 2531 | 130 |
| 2532 | 129 |
| 2533 | 130 |
| 2534 | 131 |
| 2535 | 132 |
| 2536 | 131 |
| 2537 | 129 |
| 2538 | 125 |
| 2539 | 119 |
| 2540 | 111 |
| 2541 | 107 |
| 2542 | 105 |
| 2543 | 103 |
| 2544 | 96 |
| 2545 | 94 |
| 2546 | 92 |
| 2547 | 95 |
| 2548 | 100 |
| 2549 | 108 |
| 2550 | 114 |
| 2551 | 119 |
| 2552 | 127 |
| 2553 | 134 |
| 2554 | 142 |
| 2555 | 146 |
| 2556 | 149 |
| 2557 | 153 |
| 2558 | 155 |
| 2559 | 152 |
| 2560 | 147 |
| 2561 | 142 |
| 2562 | 138 |
| 2563 | 132 |
| 2564 | 124 |
| 2565 | 114 |
| 2566 | 103 |
| 2567 | 91 |
| 2568 | 83 |
| 2569 | 72 |
| 2570 | 57 |
| 2571 | 44 |
| 2572 | 29 |
| 2573 | 13 |
| 2574 | 351 |
| 2575 | 323 |
| 2576 | 299 |
| 2577 | 278 |
| 2578 | 262 |
| 2579 | 260 |
| 2580 | 258 |
| 2581 | 260 |
| 2582 | 260 |
| 2583 | 262 |
| 2584 | 261 |
| 2585 | 257 |
| 2586 | 249 |
| 2587 | 231 |
| 2588 | 214 |
| 2589 | 199 |
| 2590 | 187 |
| 2591 | 182 |
| 2592 | 183 |
| 2593 | 184 |
| 2594 | 183 |
| 2595 | 180 |
| 2596 | 173 |
| 2597 | 166 |
| 2598 | 165 |
| 2599 | 169 |
| 2600 | 171 |
| 2601 | 169 |
| 2602 | 164 |
| 2603 | 153 |
| 2604 | 138 |
| 2605 | 121 |
| 2606 | 104 |
| 2607 | 88 |
| 2608 | 70 |
| 2609 | 50 |
| 2610 | 27 |
| 2611 | 9 |
| 2612 | 2 |
| 2613 | 3 |
| 2614 | 2 |
| 2615 | 1 |
| 2616 | 4 |
| 2617 | 4 |
| 2618 | 2 |
| 2619 | 2 |
| 2620 | 1 |
| 2621 | 3 |
| 2622 | 7 |
| 2623 | 11 |
| 2624 | 13 |
| 2625 | 14 |
| 2626 | 15 |
| 2627 | 15 |
| 2628 | 13 |
| 2629 | 14 |
| 2630 | 17 |
| 2631 | 9 |
| 2632 | 1 |
| 2633 | 3 |
| 2634 | 7 |
| 2635 | 11 |
| 2636 | 9 |
| 2637 | 4 |
| 2638 | 3 |
| 2639 | 6 |
| 2640 | 9 |
| 2641 | 11 |
| 2642 | 8 |
| 2643 | 5 |
| 2644 | 3 |
| 2645 | 1 |
| 2646 | 359 |
| 2647 | 358 |
| 2648 | 358 |
| 2649 | 356 |
| 2650 | 358 |
| 2651 | 2 |
| 2652 | 6 |
| 2653 | 9 |
| 2654 | 11 |
| 2655 | 14 |
| 2656 | 17 |
| 2657 | 18 |
| 2658 | 18 |
| 2659 | 17 |
| 2660 | 16 |
| 2661 | 16 |
| 2662 | 15 |
| 2663 | 15 |
| 2664 | 15 |
| 2665 | 16 |
| 2666 | 17 |
| 2667 | 18 |
| 2668 | 20 |
| 2669 | 21 |
| 2670 | 22 |
| 2671 | 23 |
| 2672 | 25 |
| 2673 | 26 |
| 2674 | 26 |
| 2675 | 24 |
| 2676 | 23 |
| 2677 | 22 |
| 2678 | 21 |
| 2679 | 20 |
| 2680 | 19 |
| 2681 | 18 |
| 2682 | 16 |
| 2683 | 15 |
| 2684 | 14 |
| 2685 | 14 |
| 2686 | 15 |
| 2687 | 16 |
| 2688 | 17 |
| 2689 | 18 |
| 2690 | 19 |
| 2691 | 19 |
| 2692 | 19 |
| 2693 | 19 |
| 2694 | 15 |
| 2695 | 12 |
| 2696 | 9 |
| 2697 | 6 |
| 2698 | 6 |
| 2699 | 355 |
| 2700 | 350 |
| 2701 | 345 |
| 2702 | 343 |
| 2703 | 342 |
| 2704 | 344 |
| 2705 | 334 |
| 2706 | 326 |
| 2707 | 317 |
| 2708 | 310 |
| 2709 | 304 |
| 2710 | 303 |
| 2711 | 300 |
| 2712 | 302 |
| 2713 | 305 |
| 2714 | 309 |
| 2715 | 310 |
| 2716 | 310 |
| 2717 | 310 |
| 2718 | 312 |
| 2719 | 313 |
| 2720 | 312 |
| 2721 | 305 |
| 2722 | 302 |
| 2723 | 301 |
| 2724 | 300 |
| 2725 | 298 |
| 2726 | 296 |
| 2727 | 293 |
| 2728 | 291 |
| 2729 | 291 |
| 2730 | 291 |
| 2731 | 293 |
| 2732 | 300 |
| 2733 | 310 |
| 2734 | 320 |
| 2735 | 329 |
| 2736 | 326 |
| 2737 | 317 |
| 2738 | 320 |
| 2739 | 327 |
| 2740 | 333 |
| 2741 | 335 |
| 2742 | 332 |
| 2743 | 329 |
| 2744 | 326 |
| 2745 | 323 |
| 2746 | 319 |
| 2747 | 313 |
| 2748 | 311 |
| 2749 | 310 |
| 2750 | 314 |
| 2751 | 318 |
| 2752 | 324 |
| 2753 | 328 |
| 2754 | 332 |
| 2755 | 336 |
| 2756 | 339 |
| 2757 | 333 |
| 2758 | 330 |
| 2759 | 329 |
| 2760 | 326 |
| 2761 | 323 |
| 2762 | 323 |
| 2763 | 323 |
| 2764 | 322 |
| 2765 | 317 |
| 2766 | 311 |
| 2767 | 301 |
| 2768 | 290 |
| 2769 | 280 |
| 2770 | 278 |
| 2771 | 278 |
| 2772 | 276 |
| 2773 | 270 |
| 2774 | 264 |
| 2775 | 280 |
| 2776 | 325 |
| 2777 | 7 |
| 2778 | 35 |
| 2779 | 42 |
| 2780 | 44 |
| 2781 | 41 |
| 2782 | 44 |
| 2783 | 59 |
| 2784 | 72 |
| 2785 | 61 |
| 2786 | 50 |
| 2787 | 48 |
| 2788 | 52 |
| 2789 | 48 |
| 2790 | 45 |